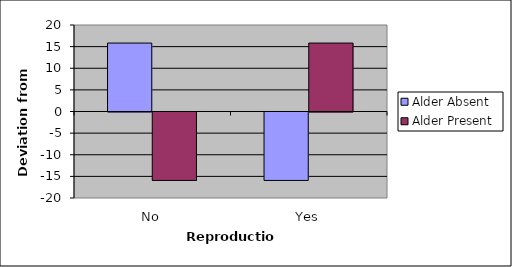
| Category | Alder Absent | Alder Present |
|---|---|---|
| No | 15.822 | -15.822 |
| Yes | -15.822 | 15.822 |